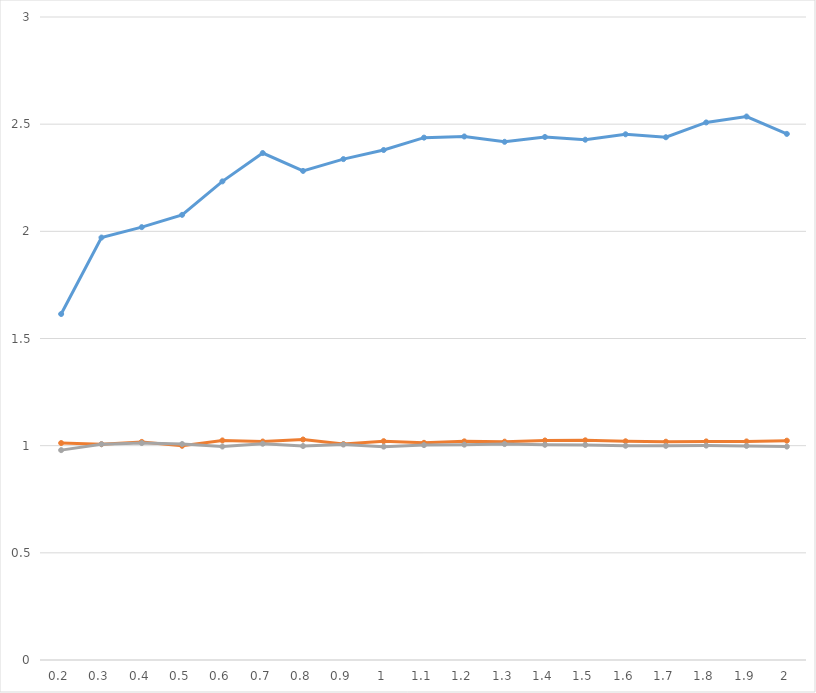
| Category | 10 | 25 | 50 |
|---|---|---|---|
| 0.2 | 1.614 | 1.012 | 0.979 |
| 0.3 | 1.971 | 1.007 | 1.007 |
| 0.4 | 2.02 | 1.018 | 1.012 |
| 0.5 | 2.077 | 0.999 | 1.008 |
| 0.6 | 2.233 | 1.024 | 0.996 |
| 0.7 | 2.365 | 1.019 | 1.009 |
| 0.8 | 2.282 | 1.029 | 0.998 |
| 0.9 | 2.337 | 1.008 | 1.005 |
| 1.0 | 2.379 | 1.021 | 0.996 |
| 1.1 | 2.437 | 1.013 | 1.003 |
| 1.2 | 2.443 | 1.02 | 1.005 |
| 1.3 | 2.418 | 1.019 | 1.008 |
| 1.4 | 2.44 | 1.024 | 1.004 |
| 1.5 | 2.428 | 1.025 | 1.003 |
| 1.6 | 2.453 | 1.02 | 1 |
| 1.7 | 2.439 | 1.018 | 0.999 |
| 1.8 | 2.508 | 1.02 | 1 |
| 1.9 | 2.536 | 1.02 | 0.999 |
| 2.0 | 2.455 | 1.023 | 0.996 |